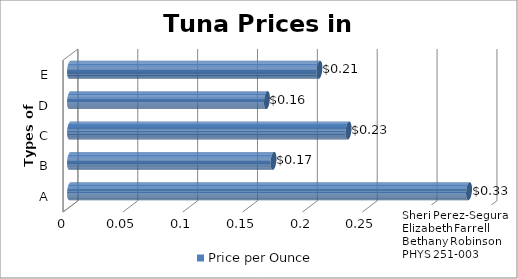
| Category | Price per Ounce |
|---|---|
| A | 0.333 |
| B | 0.17 |
| C | 0.233 |
| D | 0.164 |
| E | 0.208 |